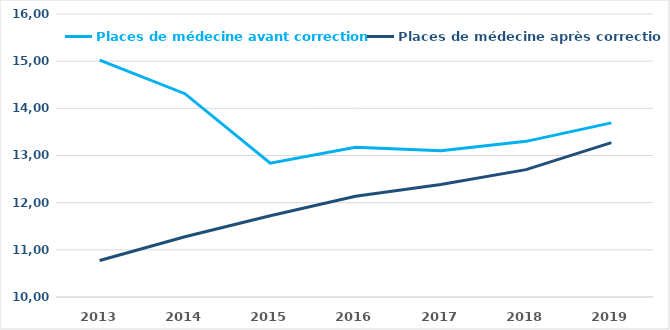
| Category | Places de médecine avant correction | Places de médecine après correction |
|---|---|---|
| 2013.0 | 15021 | 10774 |
| 2014.0 | 14310 | 11278 |
| 2015.0 | 12837 | 11724 |
| 2016.0 | 13176 | 12134 |
| 2017.0 | 13100 | 12386 |
| 2018.0 | 13300 | 12701 |
| 2019.0 | 13692 | 13273 |